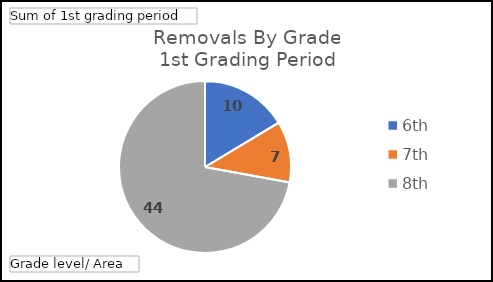
| Category | Total |
|---|---|
| 6th | 10 |
| 7th | 7 |
| 8th | 44 |